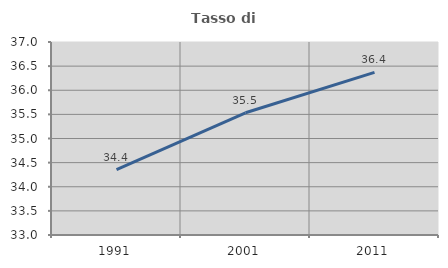
| Category | Tasso di occupazione   |
|---|---|
| 1991.0 | 34.354 |
| 2001.0 | 35.533 |
| 2011.0 | 36.372 |